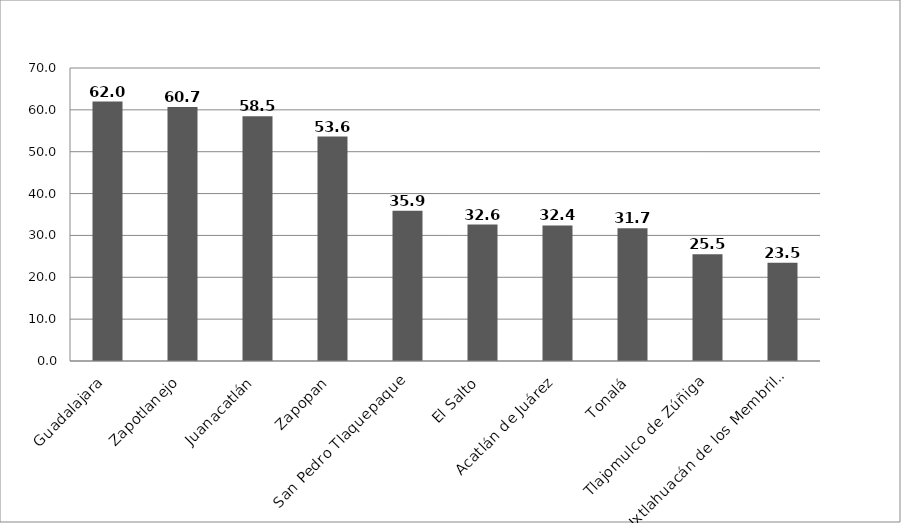
| Category | Series 0 |
|---|---|
| Guadalajara | 61.97 |
| Zapotlanejo | 60.653 |
| Juanacatlán | 58.462 |
| Zapopan | 53.632 |
| San Pedro Tlaquepaque | 35.875 |
| El Salto | 32.584 |
| Acatlán de Juárez | 32.399 |
| Tonalá | 31.738 |
| Tlajomulco de Zúñiga | 25.532 |
| Ixtlahuacán de los Membrillos | 23.469 |